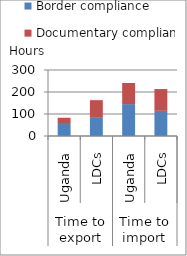
| Category | Border compliance | Documentary compliance |
|---|---|---|
| 0 | 59 | 24 |
| 1 | 85.795 | 77.114 |
| 2 | 145 | 96 |
| 3 | 114.318 | 99.114 |